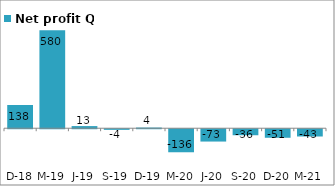
| Category | Net profit Q |
|---|---|
| 2018-12-31 | 137.68 |
| 2019-03-31 | 579.55 |
| 2019-06-30 | 12.64 |
| 2019-09-30 | -3.72 |
| 2019-12-31 | 4.1 |
| 2020-03-31 | -136.41 |
| 2020-06-30 | -73.03 |
| 2020-09-30 | -35.61 |
| 2020-12-31 | -50.57 |
| 2021-03-31 | -43.05 |